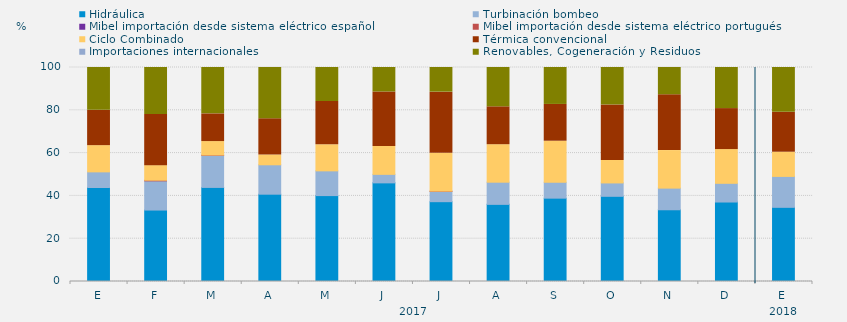
| Category | Hidráulica | Turbinación bombeo | Mibel importación desde sistema eléctrico español | Mibel importación desde sistema eléctrico portugués | Ciclo Combinado | Térmica convencional | Importaciones internacionales | Renovables, Cogeneración y Residuos |
|---|---|---|---|---|---|---|---|---|
| E | 43.929 | 7.303 | 0 | 0 | 12.254 | 16.51 | 0 | 20.004 |
| F | 33.383 | 13.641 | 0 | 0.298 | 6.82 | 23.884 | 0 | 21.974 |
| M | 43.966 | 14.984 | 0 | 0.135 | 6.303 | 12.943 | 0 | 21.669 |
| A | 40.799 | 13.738 | 0 | 0 | 4.583 | 16.933 | 0 | 23.947 |
| M | 40.143 | 11.559 | 0 | 0 | 12.186 | 20.228 | 0 | 15.883 |
| J | 46.088 | 3.981 | 0 | 0 | 13.032 | 25.463 | 0 | 11.435 |
| J | 37.298 | 4.783 | 0 | 0.134 | 17.675 | 28.595 | 0 | 11.514 |
| A | 36.044 | 10.361 | 0 | 0 | 17.518 | 17.708 | 0 | 18.369 |
| S | 38.947 | 7.407 | 0 | 0 | 19.201 | 17.187 | 0 | 17.257 |
| O | 39.807 | 6.25 | 0 | 0 | 10.484 | 25.963 | 0 | 17.496 |
| N | 33.519 | 10.116 | 0 | 0 | 17.546 | 26.088 | 0 | 12.731 |
| D | 37.142 | 8.737 | 0 | 0 | 15.771 | 19.153 | 0 | 19.198 |
| E | 34.655 | 14.449 | 0 | 0 | 11.313 | 18.638 | 0 | 20.945 |